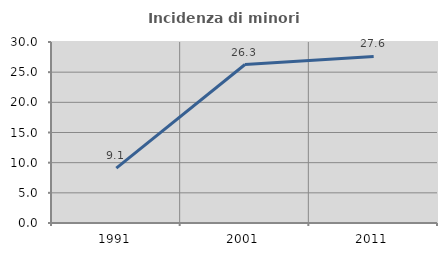
| Category | Incidenza di minori stranieri |
|---|---|
| 1991.0 | 9.091 |
| 2001.0 | 26.267 |
| 2011.0 | 27.605 |